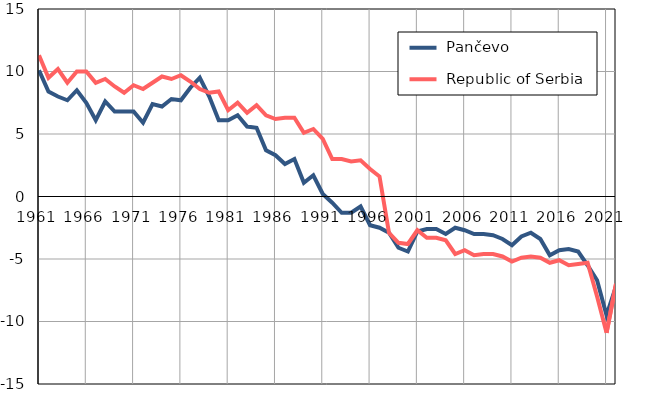
| Category |  Pančevo |  Republic of Serbia |
|---|---|---|
| 1961.0 | 10.1 | 11.3 |
| 1962.0 | 8.4 | 9.5 |
| 1963.0 | 8 | 10.2 |
| 1964.0 | 7.7 | 9.1 |
| 1965.0 | 8.5 | 10 |
| 1966.0 | 7.5 | 10 |
| 1967.0 | 6.1 | 9.1 |
| 1968.0 | 7.6 | 9.4 |
| 1969.0 | 6.8 | 8.8 |
| 1970.0 | 6.8 | 8.3 |
| 1971.0 | 6.8 | 8.9 |
| 1972.0 | 5.9 | 8.6 |
| 1973.0 | 7.4 | 9.1 |
| 1974.0 | 7.2 | 9.6 |
| 1975.0 | 7.8 | 9.4 |
| 1976.0 | 7.7 | 9.7 |
| 1977.0 | 8.7 | 9.2 |
| 1978.0 | 9.5 | 8.6 |
| 1979.0 | 8 | 8.3 |
| 1980.0 | 6.1 | 8.4 |
| 1981.0 | 6.1 | 6.9 |
| 1982.0 | 6.5 | 7.5 |
| 1983.0 | 5.6 | 6.7 |
| 1984.0 | 5.5 | 7.3 |
| 1985.0 | 3.7 | 6.5 |
| 1986.0 | 3.3 | 6.2 |
| 1987.0 | 2.6 | 6.3 |
| 1988.0 | 3 | 6.3 |
| 1989.0 | 1.1 | 5.1 |
| 1990.0 | 1.7 | 5.4 |
| 1991.0 | 0.2 | 4.6 |
| 1992.0 | -0.5 | 3 |
| 1993.0 | -1.3 | 3 |
| 1994.0 | -1.3 | 2.8 |
| 1995.0 | -0.8 | 2.9 |
| 1996.0 | -2.3 | 2.2 |
| 1997.0 | -2.5 | 1.6 |
| 1998.0 | -2.9 | -2.9 |
| 1999.0 | -4.1 | -3.7 |
| 2000.0 | -4.4 | -3.8 |
| 2001.0 | -2.8 | -2.7 |
| 2002.0 | -2.6 | -3.3 |
| 2003.0 | -2.6 | -3.3 |
| 2004.0 | -3 | -3.5 |
| 2005.0 | -2.5 | -4.6 |
| 2006.0 | -2.7 | -4.3 |
| 2007.0 | -3 | -4.7 |
| 2008.0 | -3 | -4.6 |
| 2009.0 | -3.1 | -4.6 |
| 2010.0 | -3.4 | -4.8 |
| 2011.0 | -3.9 | -5.2 |
| 2012.0 | -3.2 | -4.9 |
| 2013.0 | -2.9 | -4.8 |
| 2014.0 | -3.4 | -4.9 |
| 2015.0 | -4.7 | -5.3 |
| 2016.0 | -4.3 | -5.1 |
| 2017.0 | -4.2 | -5.5 |
| 2018.0 | -4.4 | -5.4 |
| 2019.0 | -5.5 | -5.3 |
| 2020.0 | -6.7 | -8 |
| 2021.0 | -9.5 | -10.9 |
| 2022.0 | -7.2 | -7 |